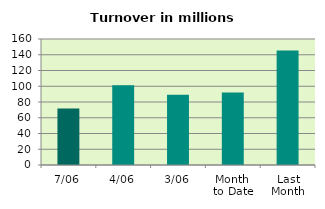
| Category | Series 0 |
|---|---|
| 7/06 | 71.846 |
| 4/06 | 101.133 |
| 3/06 | 89.183 |
| Month 
to Date | 91.977 |
| Last
Month | 145.388 |